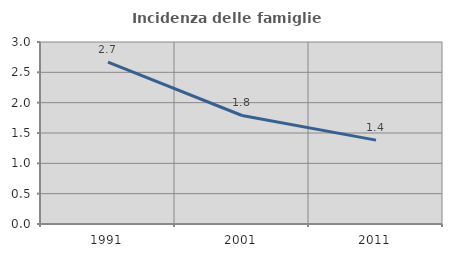
| Category | Incidenza delle famiglie numerose |
|---|---|
| 1991.0 | 2.669 |
| 2001.0 | 1.789 |
| 2011.0 | 1.382 |